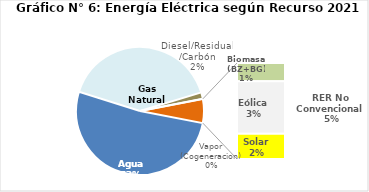
| Category | Series 0 |
|---|---|
| Agua | 2494.63 |
| Gas Natural | 1946.976 |
| Diesel/Residual/Carbón | 77.483 |
| Vapor (Cogeneracion) | 2.003 |
| Biomasa (BZ+BG) | 55.532 |
| Eólica | 159.717 |
| Solar | 76.402 |